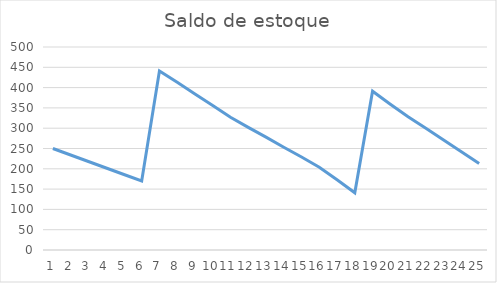
| Category | Saldo inicial |
|---|---|
| 0 | 250 |
| 1 | 234 |
| 2 | 218 |
| 3 | 202 |
| 4 | 186 |
| 5 | 170 |
| 6 | 441 |
| 7 | 413 |
| 8 | 384 |
| 9 | 356 |
| 10 | 327 |
| 11 | 302 |
| 12 | 278 |
| 13 | 253 |
| 14 | 229 |
| 15 | 204 |
| 16 | 173 |
| 17 | 141 |
| 18 | 391 |
| 19 | 359 |
| 20 | 328 |
| 21 | 300 |
| 22 | 271 |
| 23 | 242 |
| 24 | 213 |